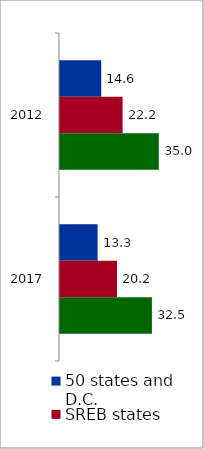
| Category | 50 states and D.C. | SREB states | State |
|---|---|---|---|
| 2012.0 | 14.588 | 22.162 | 34.974 |
| 2017.0 | 13.316 | 20.182 | 32.53 |